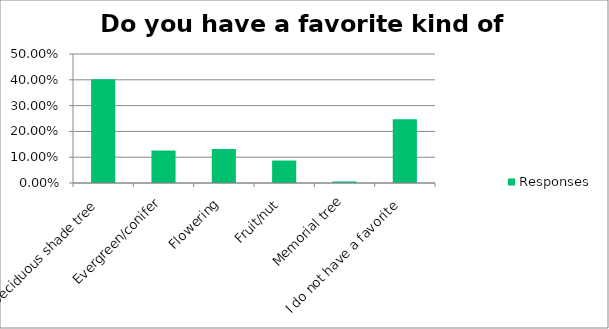
| Category | Responses |
|---|---|
| Deciduous shade tree | 0.402 |
| Evergreen/conifer | 0.126 |
| Flowering | 0.132 |
| Fruit/nut | 0.087 |
| Memorial tree | 0.006 |
| I do not have a favorite | 0.247 |